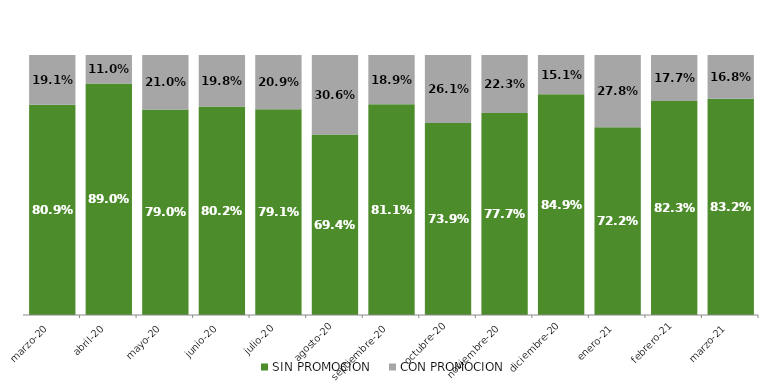
| Category | SIN PROMOCION   | CON PROMOCION   |
|---|---|---|
| 2020-03-01 | 0.809 | 0.191 |
| 2020-04-01 | 0.89 | 0.11 |
| 2020-05-01 | 0.79 | 0.21 |
| 2020-06-01 | 0.802 | 0.198 |
| 2020-07-01 | 0.791 | 0.209 |
| 2020-08-01 | 0.694 | 0.306 |
| 2020-09-01 | 0.811 | 0.189 |
| 2020-10-01 | 0.739 | 0.261 |
| 2020-11-01 | 0.777 | 0.223 |
| 2020-12-01 | 0.849 | 0.151 |
| 2021-01-01 | 0.722 | 0.278 |
| 2021-02-01 | 0.823 | 0.177 |
| 2021-03-01 | 0.832 | 0.168 |